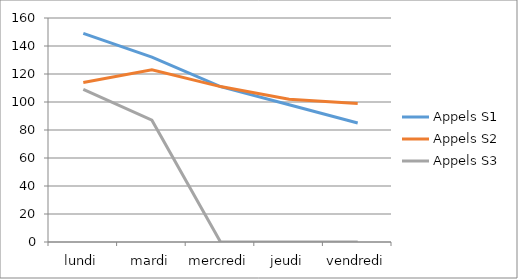
| Category | Appels S1 | Appels S2 | Appels S3 |
|---|---|---|---|
| lundi | 149 | 114 | 109 |
| mardi | 132 | 123 | 87 |
| mercredi | 111 | 111 | 0 |
| jeudi | 98 | 102 | 0 |
| vendredi | 85 | 99 | 0 |